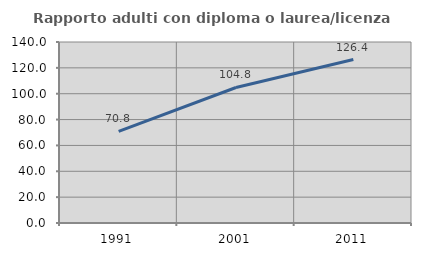
| Category | Rapporto adulti con diploma o laurea/licenza media  |
|---|---|
| 1991.0 | 70.833 |
| 2001.0 | 104.819 |
| 2011.0 | 126.437 |